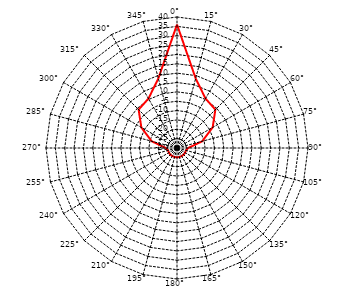
| Category | Series 1 |
|---|---|
| 0° | 36 |
| 15° | 8.5 |
| 30° | 0.5 |
| 45° | -1 |
| 60° | -8 |
| 75° | -16 |
| 90° | -24 |
| 105° | -25 |
| 120° | -25 |
| 135° | -25 |
| 150° | -25 |
| 165° | -25 |
| 180° | -25 |
| 195° | -25 |
| 210° | -25 |
| 225° | -25 |
| 240° | -25 |
| 255° | -25 |
| 270° | -24 |
| 285° | -16 |
| 300° | -8 |
| 315° | -1 |
| 330° | 0.5 |
| 345° | 8.5 |